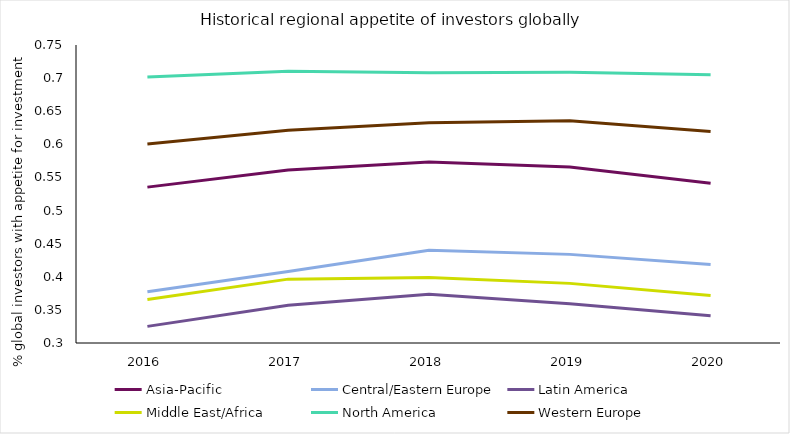
| Category | Asia-Pacific | Central/Eastern Europe | Latin America | Middle East/Africa | North America | Western Europe |
|---|---|---|---|---|---|---|
| 2016.0 | 0.535 | 0.377 | 0.325 | 0.366 | 0.702 | 0.6 |
| 2017.0 | 0.561 | 0.408 | 0.357 | 0.396 | 0.71 | 0.621 |
| 2018.0 | 0.573 | 0.44 | 0.374 | 0.399 | 0.708 | 0.632 |
| 2019.0 | 0.566 | 0.434 | 0.359 | 0.39 | 0.709 | 0.636 |
| 2020.0 | 0.541 | 0.418 | 0.341 | 0.372 | 0.705 | 0.619 |